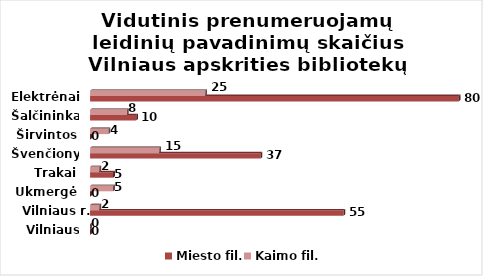
| Category | Miesto fil. | Kaimo fil. |
|---|---|---|
| Vilniaus m. | 0 | 0 |
| Vilniaus r. | 55 | 2 |
| Ukmergė | 0 | 5 |
| Trakai | 5 | 2 |
| Švenčionys | 37 | 15 |
| Širvintos | 0 | 4 |
| Šalčininkai | 10 | 8 |
| Elektrėnai | 80 | 25 |